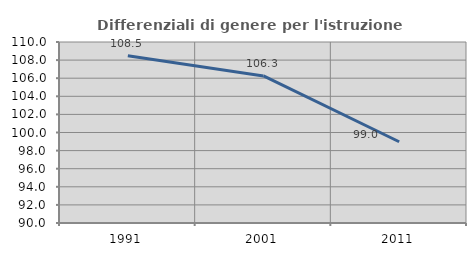
| Category | Differenziali di genere per l'istruzione superiore |
|---|---|
| 1991.0 | 108.475 |
| 2001.0 | 106.25 |
| 2011.0 | 98.98 |